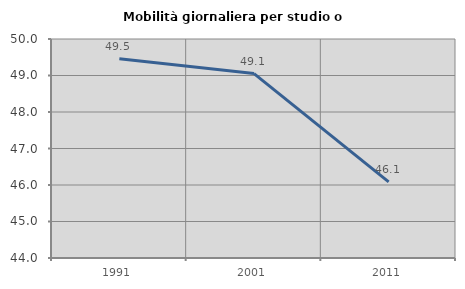
| Category | Mobilità giornaliera per studio o lavoro |
|---|---|
| 1991.0 | 49.458 |
| 2001.0 | 49.053 |
| 2011.0 | 46.087 |